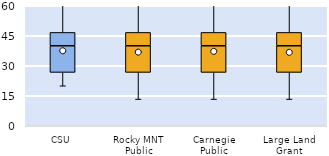
| Category | 25th | 50th | 75th |
|---|---|---|---|
| CSU | 26.667 | 13.333 | 6.667 |
| Rocky MNT Public | 26.667 | 13.333 | 6.667 |
| Carnegie Public | 26.667 | 13.333 | 6.667 |
| Large Land Grant | 26.667 | 13.333 | 6.667 |